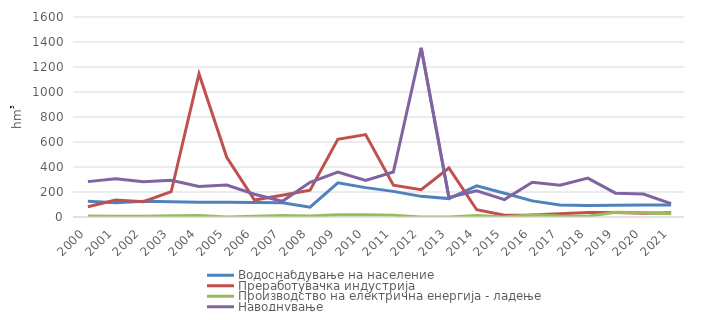
| Category | Водоснабдување на население | Преработувачка индустрија | Производство на електрична енергија - ладење | Наводнување |
|---|---|---|---|---|
| 2000.0 | 126.6 | 82.1 | 8.9 | 283 |
| 2001.0 | 114.4 | 136.1 | 6.9 | 306.7 |
| 2002.0 | 125.9 | 122.1 | 6.6 | 281.4 |
| 2003.0 | 122.4 | 202.1 | 9.8 | 293.3 |
| 2004.0 | 118.6 | 1146 | 12.4 | 244.1 |
| 2005.0 | 117.8 | 478 | 0.5 | 255.1 |
| 2006.0 | 115.8 | 136.1 | 5.9 | 182 |
| 2007.0 | 114.8 | 174.5 | 12.3 | 125.5 |
| 2008.0 | 79 | 215 | 8 | 278 |
| 2009.0 | 273.8 | 622 | 18.1 | 360 |
| 2010.0 | 235 | 659 | 18 | 293 |
| 2011.0 | 205 | 254 | 15 | 360 |
| 2012.0 | 165.1 | 218.8 | 0 | 1353.2 |
| 2013.0 | 147.1 | 391.8 | 0 | 156.5 |
| 2014.0 | 249 | 58 | 12 | 209 |
| 2015.0 | 190 | 14 | 0.1 | 139 |
| 2016.0 | 129 | 16.8 | 17.6 | 277.8 |
| 2017.0 | 95.2 | 26.8 | 8.3 | 254.1 |
| 2018.0 | 91.5 | 35.9 | 5.9 | 310.8 |
| 2019.0 | 94.582 | 36.2 | 38.149 | 190.764 |
| 2020.0 | 96.747 | 30.961 | 35.149 | 183.781 |
| 2021.0 | 95.7 | 34.4 | 26.3 | 107.6 |